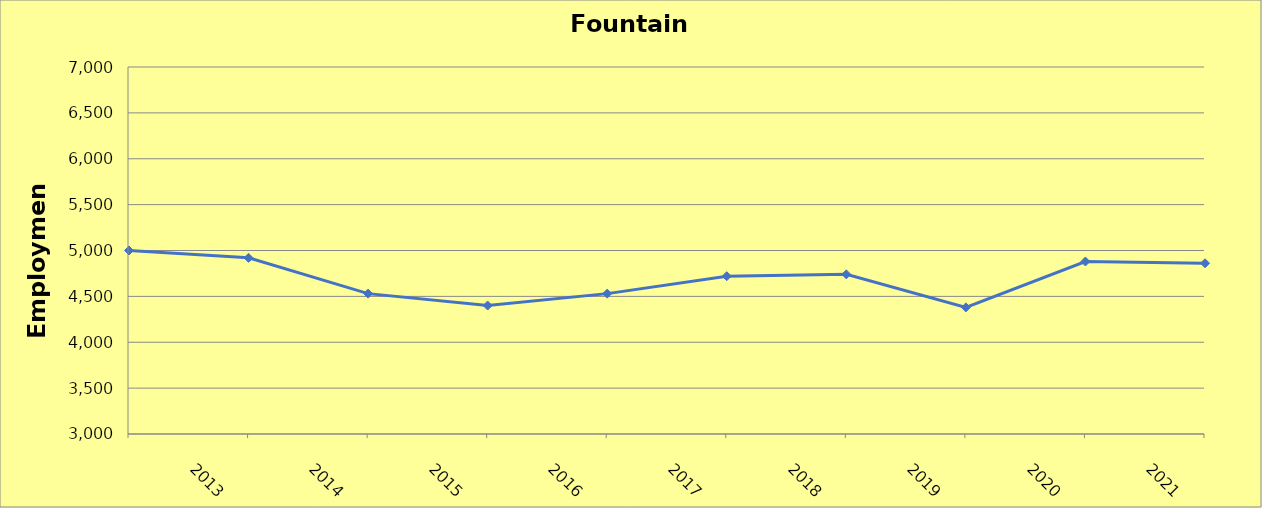
| Category | Fountain County |
|---|---|
| 2013.0 | 5000 |
| 2014.0 | 4920 |
| 2015.0 | 4530 |
| 2016.0 | 4400 |
| 2017.0 | 4530 |
| 2018.0 | 4720 |
| 2019.0 | 4740 |
| 2020.0 | 4380 |
| 2021.0 | 4880 |
| 2022.0 | 4861 |